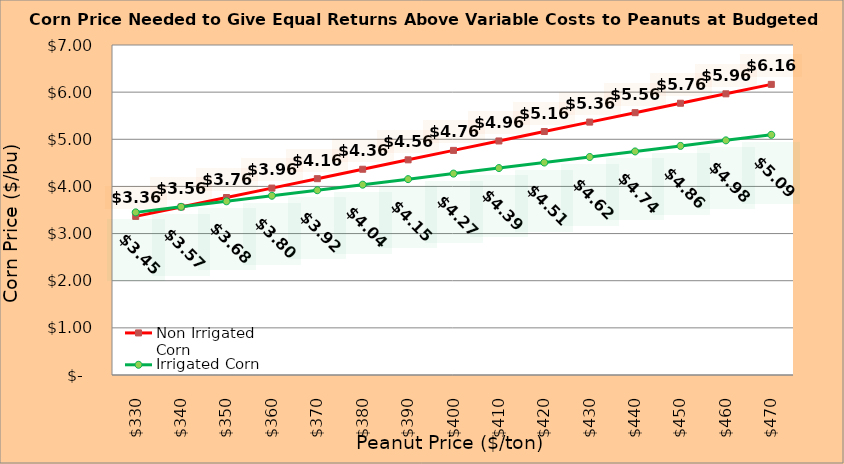
| Category | Non Irrigated Corn | Irrigated Corn |
|---|---|---|
| 330.0 | 3.365 | 3.45 |
| 340.0 | 3.565 | 3.567 |
| 350.0 | 3.765 | 3.685 |
| 360.0 | 3.965 | 3.802 |
| 370.0 | 4.165 | 3.92 |
| 380.0 | 4.365 | 4.037 |
| 390.0 | 4.565 | 4.155 |
| 400.0 | 4.765 | 4.272 |
| 410.0 | 4.965 | 4.39 |
| 420.0 | 5.165 | 4.507 |
| 430.0 | 5.365 | 4.625 |
| 440.0 | 5.565 | 4.742 |
| 450.0 | 5.765 | 4.86 |
| 460.0 | 5.965 | 4.977 |
| 470.0 | 6.165 | 5.095 |